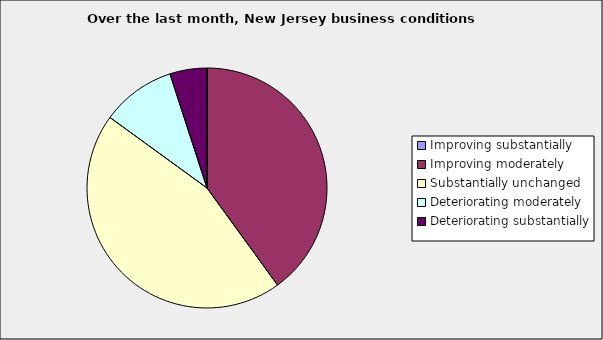
| Category | Series 0 |
|---|---|
| Improving substantially | 0 |
| Improving moderately | 0.4 |
| Substantially unchanged | 0.45 |
| Deteriorating moderately | 0.1 |
| Deteriorating substantially | 0.05 |